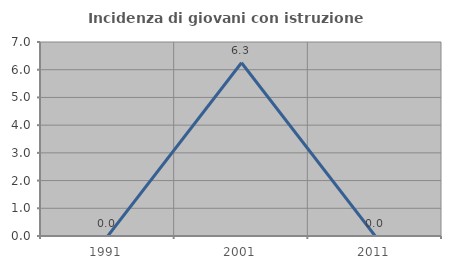
| Category | Incidenza di giovani con istruzione universitaria |
|---|---|
| 1991.0 | 0 |
| 2001.0 | 6.25 |
| 2011.0 | 0 |